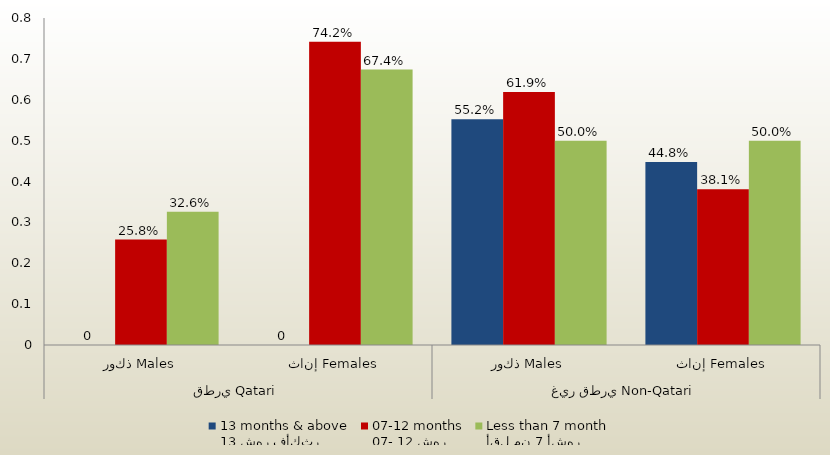
| Category | 13 شهر فأكثر
13 months & above | 07- 12 شهر
07-12 months | أقل من 7 أشهر
Less than 7 month  |
|---|---|---|---|
| 0 | 0 | 0.258 | 0.326 |
| 1 | 0 | 0.742 | 0.674 |
| 2 | 0.552 | 0.619 | 0.5 |
| 3 | 0.448 | 0.381 | 0.5 |